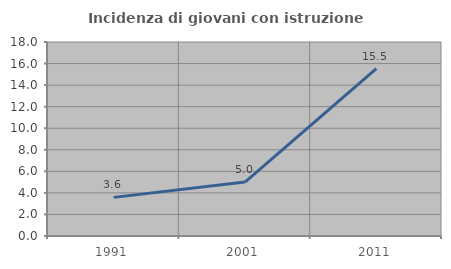
| Category | Incidenza di giovani con istruzione universitaria |
|---|---|
| 1991.0 | 3.584 |
| 2001.0 | 5 |
| 2011.0 | 15.533 |